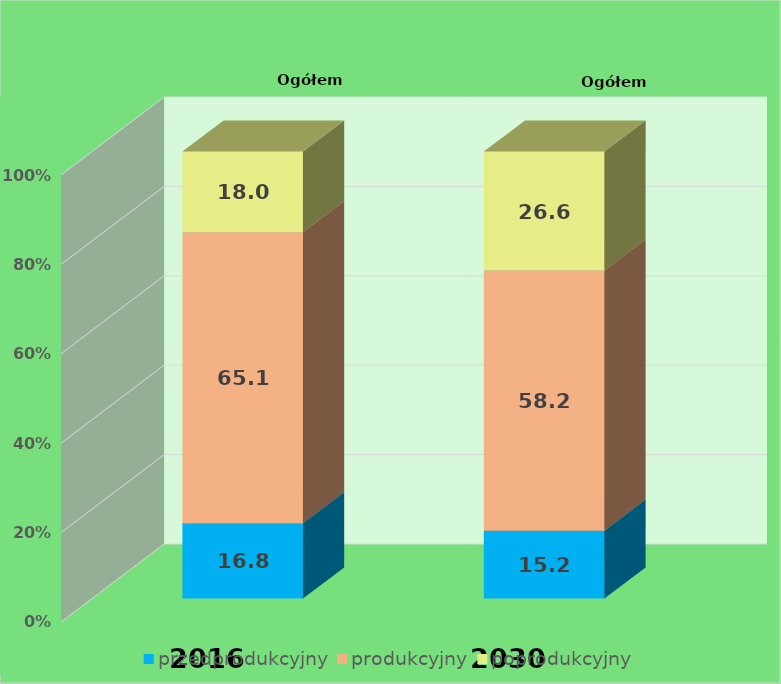
| Category | przedprodukcyjny | produkcyjny | poprodukcyjny |
|---|---|---|---|
| 2016.0 | 16.845 | 65.112 | 18.043 |
| 2030.0 | 15.17 | 58.204 | 26.627 |